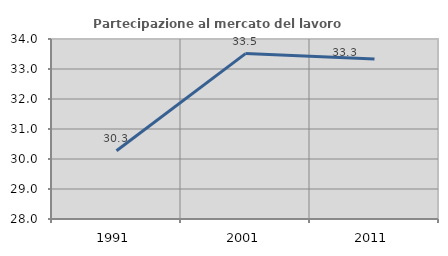
| Category | Partecipazione al mercato del lavoro  femminile |
|---|---|
| 1991.0 | 30.275 |
| 2001.0 | 33.514 |
| 2011.0 | 33.333 |